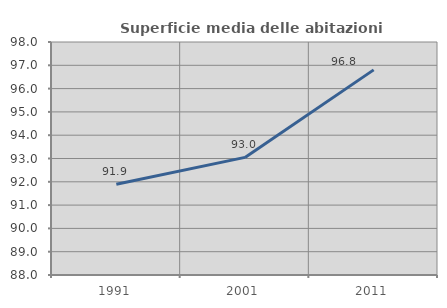
| Category | Superficie media delle abitazioni occupate |
|---|---|
| 1991.0 | 91.897 |
| 2001.0 | 93.048 |
| 2011.0 | 96.804 |